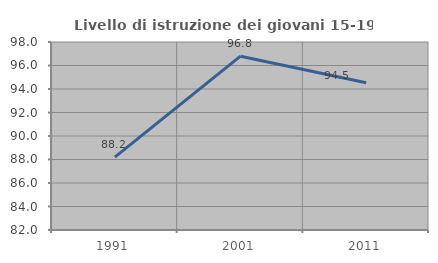
| Category | Livello di istruzione dei giovani 15-19 anni |
|---|---|
| 1991.0 | 88.199 |
| 2001.0 | 96.793 |
| 2011.0 | 94.539 |